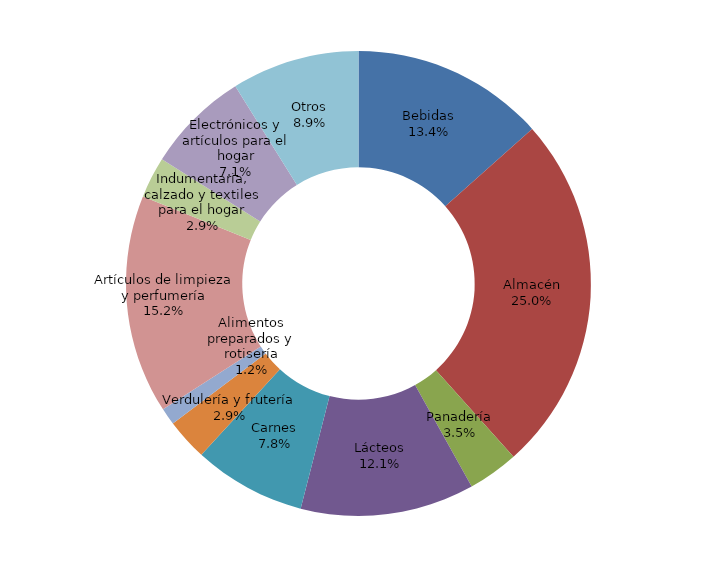
| Category | Series 0 |
|---|---|
| Bebidas | 17998850.266 |
| Almacén | 33485506.792 |
| Panadería | 4722854.266 |
| Lácteos | 16221638.761 |
| Carnes | 10470623.835 |
| Verdulería y frutería | 3896733.834 |
| Alimentos preparados y rotisería | 1581567.17 |
| Artículos de limpieza y perfumería | 20406280.803 |
| Indumentaria, calzado y textiles para el hogar | 3823775.58 |
| Electrónicos y artículos para el hogar | 9589100.969 |
| Otros | 11917530.968 |